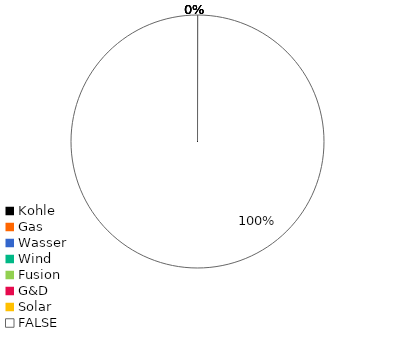
| Category | Kohle Gas Wasser Wind Fusion G&D Solar FALSE |
|---|---|
| Kohle | 0 |
| Gas | 0 |
| Wasser | 0 |
| Wind | 0 |
| Fusion | 0 |
| G&D | 0 |
| Solar | 0 |
| FALSE | 1 |